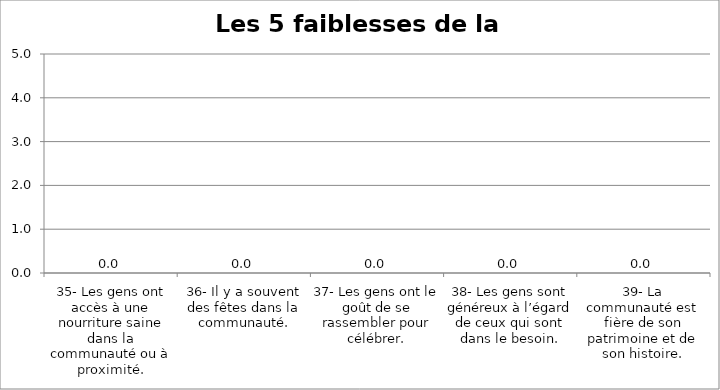
| Category | Les 5 faiblesses |
|---|---|
| 35- Les gens ont accès à une nourriture saine dans la communauté ou à proximité. | 0 |
| 36- Il y a souvent des fêtes dans la communauté. | 0 |
| 37- Les gens ont le goût de se rassembler pour célébrer. | 0 |
| 38- Les gens sont généreux à l’égard de ceux qui sont dans le besoin. | 0 |
| 39- La communauté est fière de son patrimoine et de son histoire. | 0 |